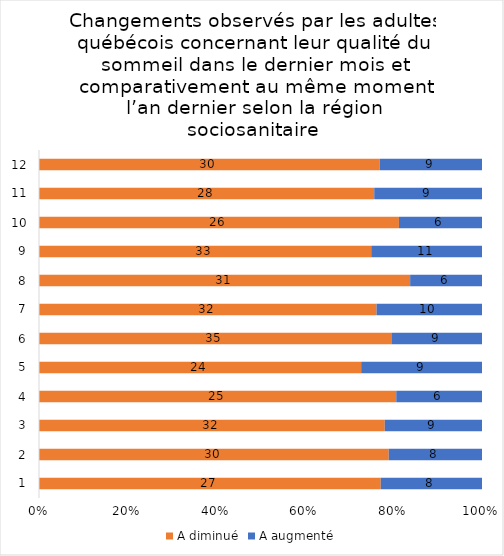
| Category | A diminué | A augmenté |
|---|---|---|
| 0 | 27 | 8 |
| 1 | 30 | 8 |
| 2 | 32 | 9 |
| 3 | 25 | 6 |
| 4 | 24 | 9 |
| 5 | 35 | 9 |
| 6 | 32 | 10 |
| 7 | 31 | 6 |
| 8 | 33 | 11 |
| 9 | 26 | 6 |
| 10 | 28 | 9 |
| 11 | 30 | 9 |